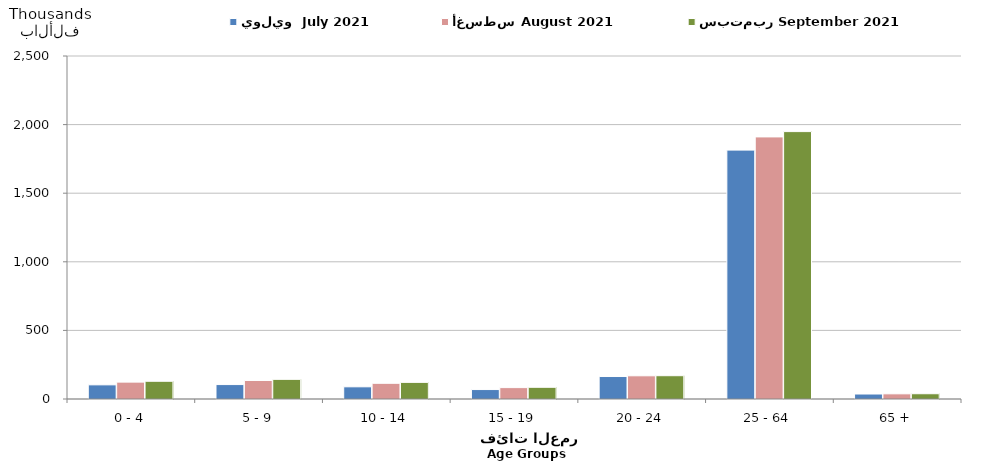
| Category | يوليو  July 2021 | أغسطس August 2021  | سبتمبر September 2021  |
|---|---|---|---|
| 0 - 4 | 103108 | 123023 | 129201 |
| 5 - 9 | 105162 | 134887 | 143228 |
| 10 - 14 | 88805 | 114408 | 121236 |
| 15 - 19 | 68878 | 82992 | 85358 |
| 20 - 24 | 163782 | 169017 | 169762 |
| 25 - 64 | 1813974 | 1910258 | 1948944 |
| 65 + | 36302 | 37613 | 38349 |